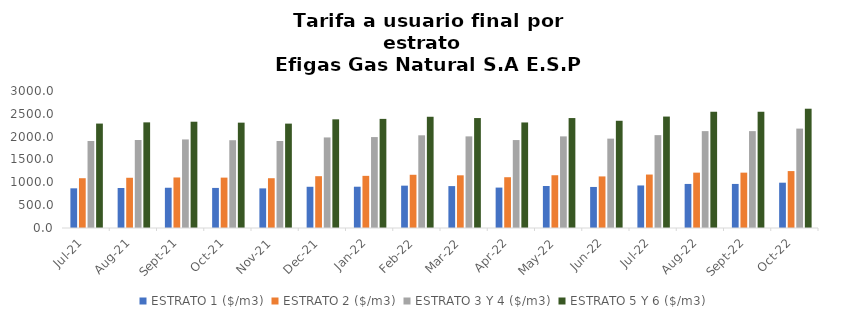
| Category | ESTRATO 1 ($/m3) | ESTRATO 2 ($/m3) | ESTRATO 3 Y 4 ($/m3) | ESTRATO 5 Y 6 ($/m3) |
|---|---|---|---|---|
| 2021-07-01 | 868.83 | 1090.13 | 1905.6 | 2286.72 |
| 2021-08-01 | 876.05 | 1100 | 1927.66 | 2313.192 |
| 2021-09-01 | 881.58 | 1106.36 | 1939.48 | 2327.376 |
| 2021-10-01 | 877.63 | 1103.17 | 1922.44 | 2306.928 |
| 2021-11-01 | 867.65 | 1090.23 | 1904.78 | 2285.736 |
| 2021-12-01 | 902.63 | 1134.54 | 1983.18 | 2379.816 |
| 2022-01-01 | 904.05 | 1141.94 | 1991.19 | 2389.428 |
| 2022-02-01 | 927.29 | 1165.44 | 2029.87 | 2435.844 |
| 2022-03-01 | 917.57 | 1153.65 | 2006.27 | 2407.524 |
| 2022-04-01 | 884.99 | 1111.99 | 1925.89 | 2311.068 |
| 2022-05-01 | 919.5 | 1155.39 | 2006.32 | 2407.584 |
| 2022-06-01 | 898.69 | 1129.49 | 1956.87 | 2348.244 |
| 2022-07-01 | 931.44 | 1170.63 | 2033.52 | 2440.224 |
| 2022-08-01 | 964.95 | 1212.1 | 2121.38 | 2545.656 |
| 2022-09-01 | 964.95 | 1212.1 | 2121.38 | 2545.656 |
| 2022-10-01 | 992.06 | 1246.38 | 2176.65 | 2611.98 |